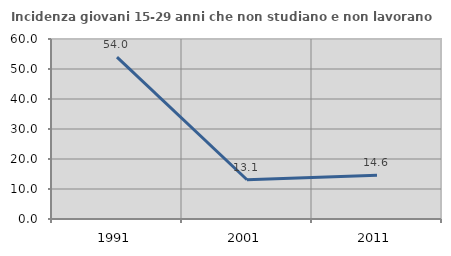
| Category | Incidenza giovani 15-29 anni che non studiano e non lavorano  |
|---|---|
| 1991.0 | 53.988 |
| 2001.0 | 13.09 |
| 2011.0 | 14.592 |